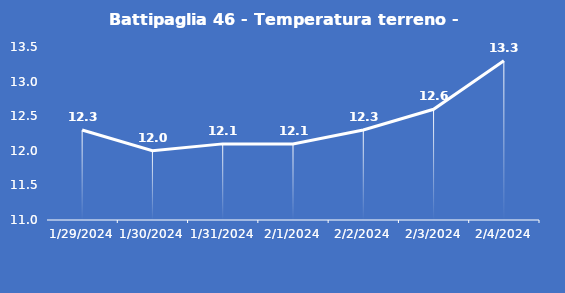
| Category | Battipaglia 46 - Temperatura terreno - Max (°C) |
|---|---|
| 1/29/24 | 12.3 |
| 1/30/24 | 12 |
| 1/31/24 | 12.1 |
| 2/1/24 | 12.1 |
| 2/2/24 | 12.3 |
| 2/3/24 | 12.6 |
| 2/4/24 | 13.3 |